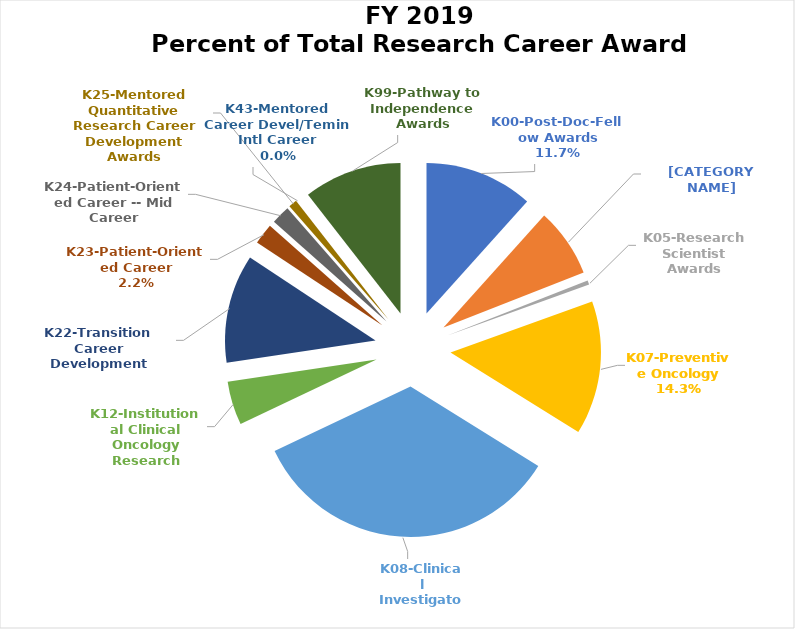
| Category | Series 0 |
|---|---|
| K00-Post-Doc-Fellow Awards | 0.117 |
| K01-Temin Total | 0.074 |
| K05-Research Scientist Awards | 0.004 |
| K07-Preventive Oncology | 0.143 |
| K08-Clinical Investigator | 0.341 |
| K12-Institutional Clinical Oncology Research | 0.047 |
| K22-Transition Career Development | 0.117 |
| K23-Patient-Oriented Career | 0.022 |
| K24-Patient-Oriented Career -- Mid Career | 0.02 |
| K25-Mentored Quantitative Research Career Development Awards | 0.009 |
| K43-Mentored Career Devel/Temin Intl Career | 0 |
| K99-Pathway to Independence Awards | 0.105 |